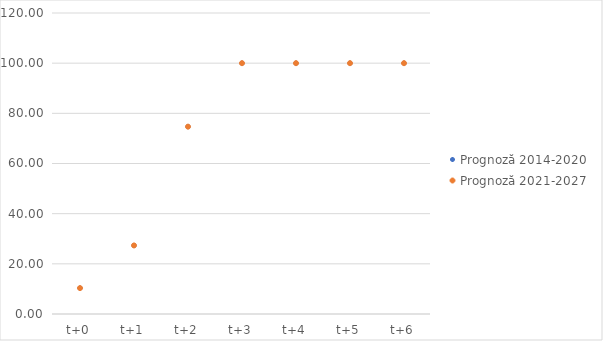
| Category | Prognoză 2014-2020 | Prognoză 2021-2027 |
|---|---|---|
| t+0 | 10.33 | 10.33 |
| t+1 | 27.33 | 27.33 |
| t+2 | 74.687 | 74.687 |
| t+3 | 100 | 100 |
| t+4 | 100 | 100 |
| t+5 | 100 | 100 |
| t+6 | 100 | 100 |